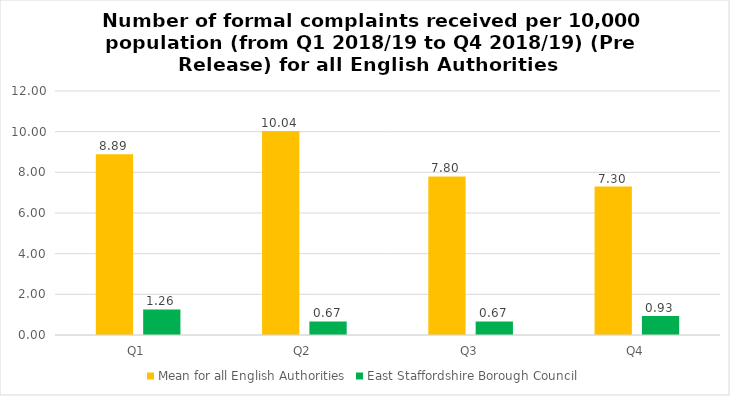
| Category | Mean for all English Authorities | East Staffordshire Borough Council |
|---|---|---|
| Q1 | 8.887 | 1.26 |
| Q2 | 10.036 | 0.67 |
| Q3 | 7.798 | 0.67 |
| Q4 | 7.301 | 0.93 |